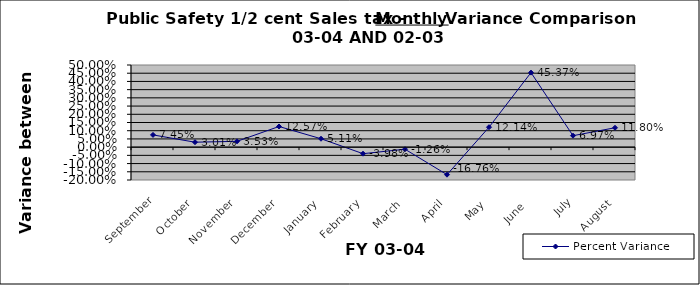
| Category | Percent Variance |
|---|---|
| September | 0.074 |
| October | 0.03 |
| November | 0.035 |
| December | 0.126 |
| January | 0.051 |
| February | -0.04 |
| March | -0.013 |
| April | -0.168 |
| May | 0.121 |
| June  | 0.454 |
| July | 0.07 |
| August | 0.118 |